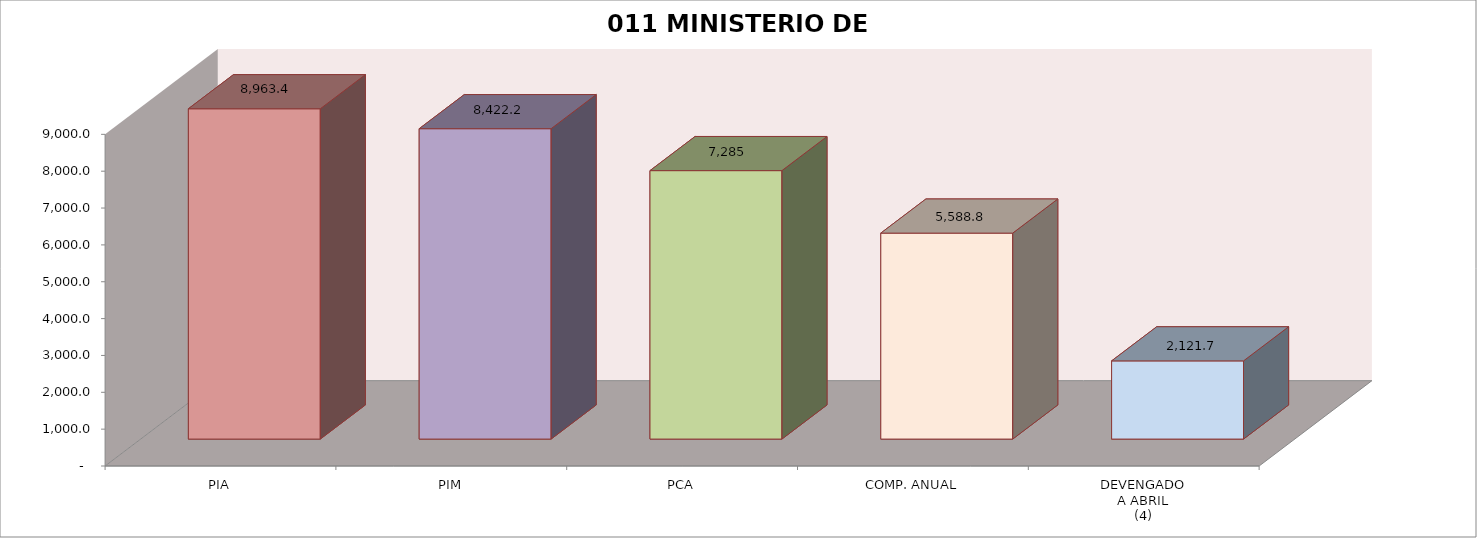
| Category | 011 MINISTERIO DE SALUD |
|---|---|
| PIA | 8963.39 |
| PIM | 8422.208 |
| PCA | 7284.659 |
| COMP. ANUAL | 5588.806 |
| DEVENGADO
A ABRIL
(4) | 2121.691 |